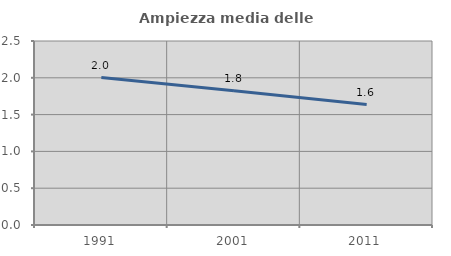
| Category | Ampiezza media delle famiglie |
|---|---|
| 1991.0 | 2.003 |
| 2001.0 | 1.823 |
| 2011.0 | 1.636 |